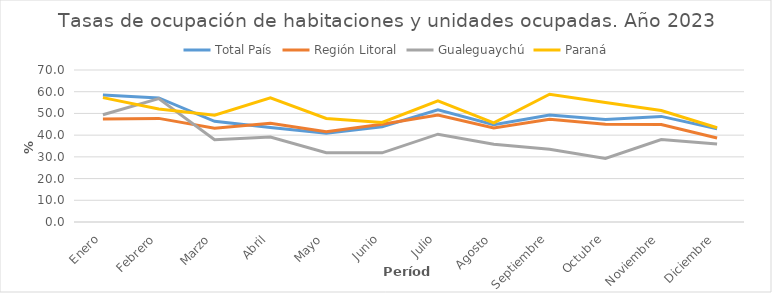
| Category | Total País | Región Litoral | Gualeguaychú | Paraná |
|---|---|---|---|---|
| Enero | 58.488 | 47.448 | 49.404 | 57.279 |
| Febrero | 57.125 | 47.72 | 56.853 | 52.028 |
| Marzo | 46.364 | 43.151 | 37.926 | 49.156 |
| Abril | 43.572 | 45.468 | 39.13 | 57.19 |
| Mayo | 40.851 | 41.515 | 31.927 | 47.706 |
| Junio | 43.849 | 45.032 | 31.842 | 45.857 |
| Julio | 51.663 | 49.232 | 40.437 | 55.791 |
| Agosto | 44.83 | 43.33 | 35.776 | 45.674 |
| Septiembre | 49.312 | 47.308 | 33.544 | 58.829 |
| Octubre | 47.184 | 45.07 | 29.269 | 55.056 |
| Noviembre | 48.628 | 44.882 | 37.939 | 51.321 |
| Diciembre | 42.964 | 38.702 | 35.879 | 43.41 |